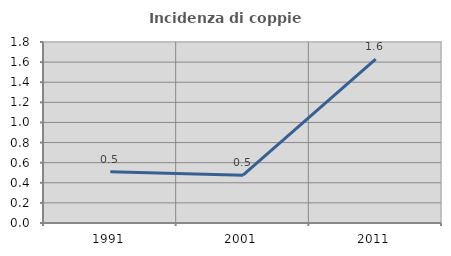
| Category | Incidenza di coppie miste |
|---|---|
| 1991.0 | 0.511 |
| 2001.0 | 0.475 |
| 2011.0 | 1.63 |